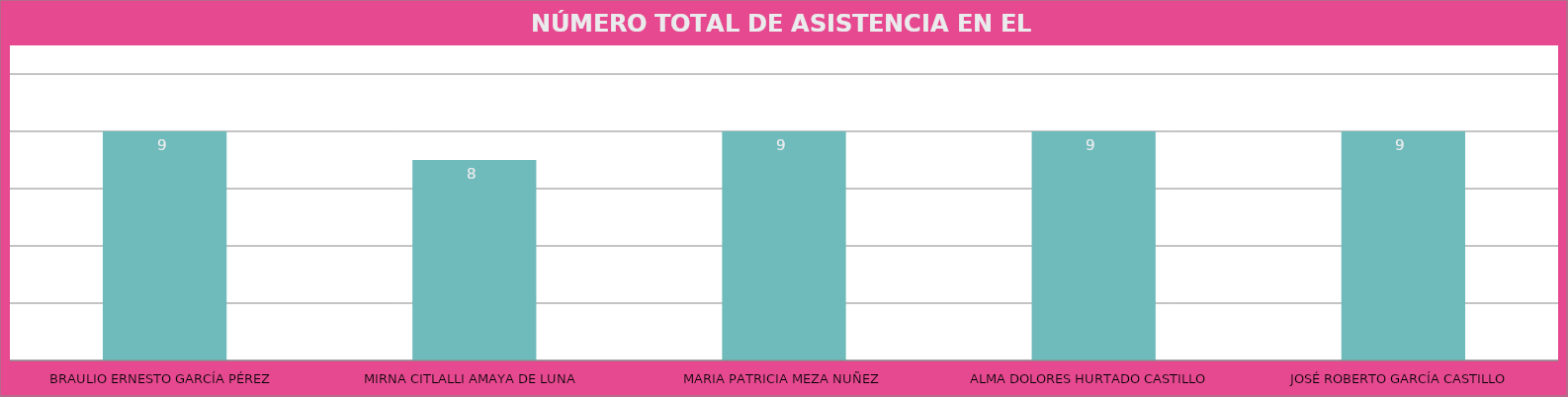
| Category | BRAULIO ERNESTO GARCÍA PÉREZ |
|---|---|
| BRAULIO ERNESTO GARCÍA PÉREZ | 9 |
| MIRNA CITLALLI AMAYA DE LUNA | 8 |
| MARIA PATRICIA MEZA NUÑEZ | 9 |
| ALMA DOLORES HURTADO CASTILLO | 9 |
| JOSÉ ROBERTO GARCÍA CASTILLO | 9 |